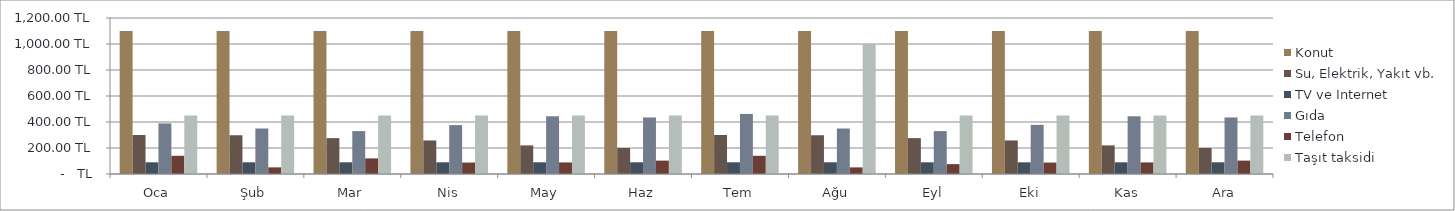
| Category | Konut | Su, Elektrik, Yakıt vb. | TV ve Internet | Gıda | Telefon | Taşıt taksidi |
|---|---|---|---|---|---|---|
| Oca | 1100 | 300 | 90 | 389 | 140 | 450 |
| Şub | 1100 | 298 | 90 | 350 | 50.93 | 450 |
| Mar | 1100 | 276 | 90 | 330 | 120 | 450 |
| Nis | 1100 | 258 | 90 | 376 | 88 | 450 |
| May | 1100 | 220 | 90 | 444 | 89 | 450 |
| Haz | 1100 | 200 | 90 | 435 | 103 | 450 |
| Tem | 1100 | 300 | 90 | 462 | 140 | 450 |
| Ağu | 1100 | 298 | 90 | 350 | 50.93 | 1000 |
| Eyl | 1100 | 276 | 90 | 330 | 76 | 450 |
| Eki | 1100 | 258 | 90 | 378 | 88 | 450 |
| Kas | 1100 | 220 | 90 | 444 | 89 | 450 |
| Ara | 1100 | 200 | 90 | 435 | 103 | 450 |